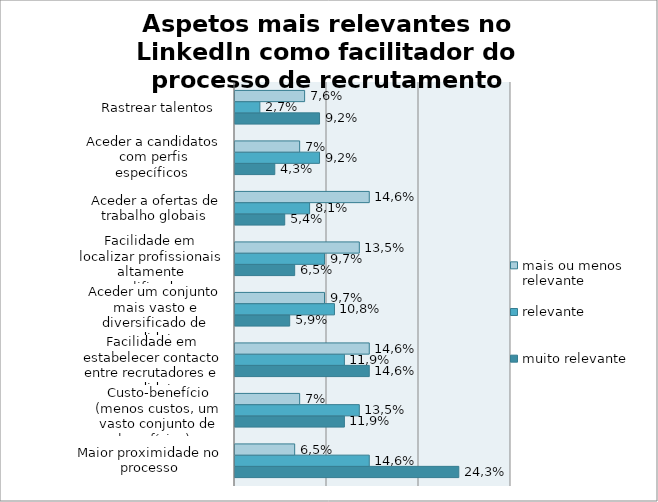
| Category | muito relevante | relevante | mais ou menos relevante |
|---|---|---|---|
| Maior proximidade no processo | 24.324 | 14.595 | 6.486 |
| Custo-benefício (menos custos, um vasto conjunto de benefícios)   | 11.892 | 13.514 | 7.027 |
| Facilidade em estabelecer contacto entre recrutadores e candidatos | 14.595 | 11.892 | 14.595 |
| Aceder um conjunto mais vasto e diversificado de candidatos  | 5.946 | 10.811 | 9.73 |
| Facilidade em localizar profissionais altamente qualificados  | 6.486 | 9.73 | 13.514 |
| Aceder a ofertas de trabalho globais  | 5.405 | 8.108 | 14.595 |
| Aceder a candidatos com perfis específicos  | 4.324 | 9.189 | 7.027 |
| Rastrear talentos  | 9.189 | 2.703 | 7.568 |